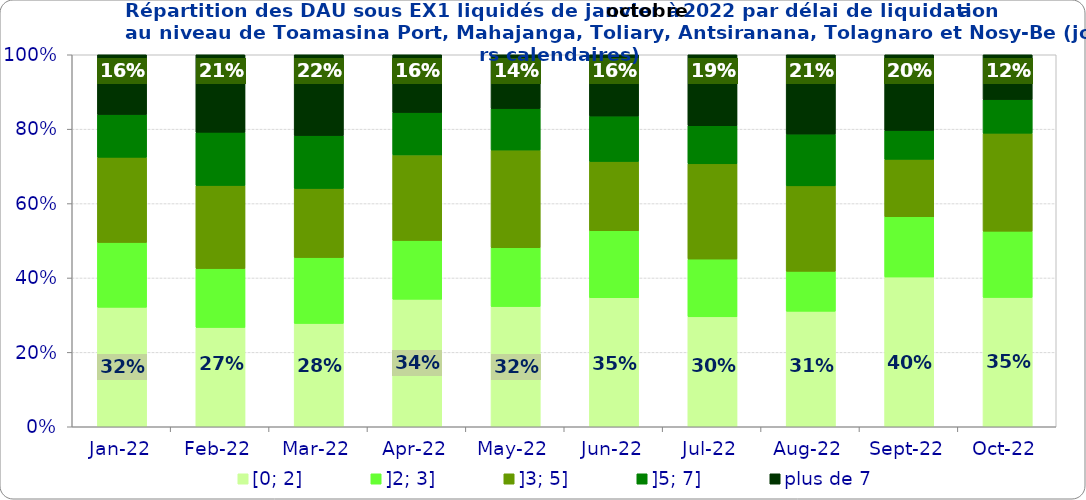
| Category | [0; 2] | ]2; 3] | ]3; 5] | ]5; 7] | plus de 7 |
|---|---|---|---|---|---|
| 2022-01-01 | 0.321 | 0.174 | 0.229 | 0.115 | 0.161 |
| 2022-02-01 | 0.267 | 0.158 | 0.223 | 0.143 | 0.208 |
| 2022-03-01 | 0.278 | 0.177 | 0.186 | 0.142 | 0.217 |
| 2022-04-01 | 0.343 | 0.158 | 0.23 | 0.114 | 0.155 |
| 2022-05-01 | 0.323 | 0.158 | 0.262 | 0.111 | 0.145 |
| 2022-06-01 | 0.347 | 0.18 | 0.186 | 0.122 | 0.165 |
| 2022-07-01 | 0.296 | 0.155 | 0.256 | 0.102 | 0.191 |
| 2022-08-01 | 0.31 | 0.107 | 0.23 | 0.139 | 0.213 |
| 2022-09-01 | 0.403 | 0.162 | 0.154 | 0.078 | 0.204 |
| 2022-10-01 | 0.348 | 0.178 | 0.263 | 0.09 | 0.121 |